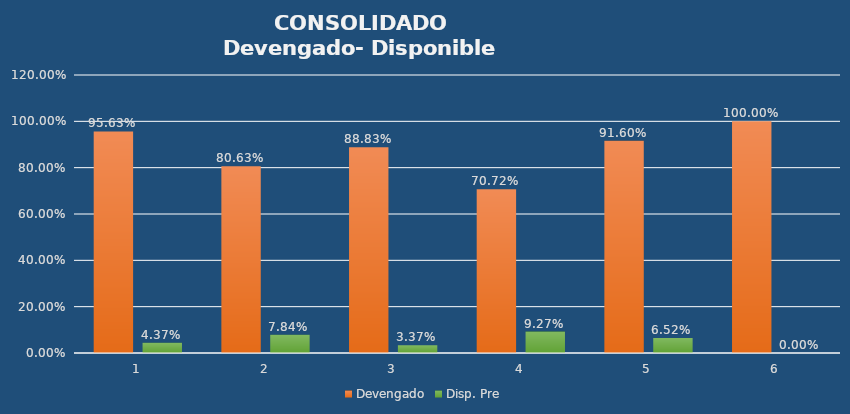
| Category | Devengado | Disp. Pre |
|---|---|---|
| 0 | 0.956 | 0.044 |
| 1 | 0.806 | 0.078 |
| 2 | 0.888 | 0.034 |
| 3 | 0.707 | 0.093 |
| 4 | 0.916 | 0.065 |
| 5 | 1 | 0 |